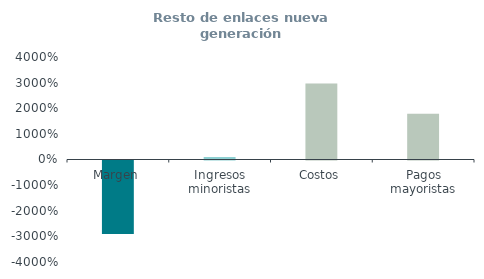
| Category | Resto de enlaces nueva generación
(% ingresos) |
|---|---|
| Margen | -28.685 |
| Ingresos minoristas | 1 |
| Costos | 29.685 |
| Pagos mayoristas | 17.867 |